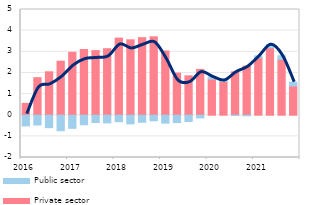
| Category | Private sector  | Public sector |
|---|---|---|
| 2016 | 0.559 | -0.507 |
| II | 1.776 | -0.463 |
| III | 2.053 | -0.589 |
| IV | 2.556 | -0.733 |
| 2017 | 2.977 | -0.621 |
| II | 3.109 | -0.452 |
| III | 3.055 | -0.347 |
| IV | 3.145 | -0.363 |
| 2018 | 3.649 | -0.305 |
| II | 3.567 | -0.411 |
| III | 3.668 | -0.334 |
| IV | 3.71 | -0.263 |
| 2019 | 3.039 | -0.375 |
| II | 1.992 | -0.349 |
| III | 1.862 | -0.298 |
| IV | 2.168 | -0.13 |
| 2020 | 1.708 | 0.102 |
| II | 1.599 | 0.045 |
| III | 2.051 | -0.014 |
| IV | 2.322 | -0.028 |
| 2021 | 2.718 | 0.089 |
| II | 3.189 | 0.148 |
| III | 2.641 | 0.174 |
| IV | 1.382 | 0.178 |